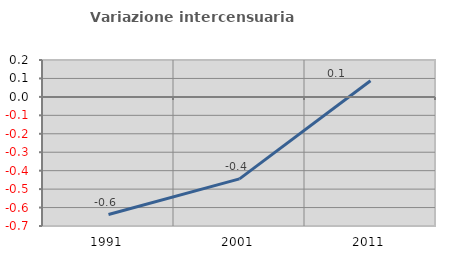
| Category | Variazione intercensuaria annua |
|---|---|
| 1991.0 | -0.638 |
| 2001.0 | -0.445 |
| 2011.0 | 0.088 |